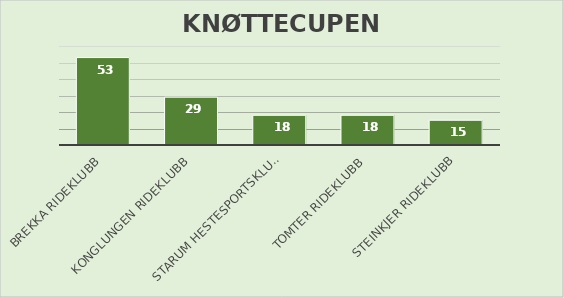
| Category | Series 0 | Series 1 | Series 2 | Series 3 | Series 4 | Series 5 | Series 6 | Series 7 | Series 8 | Series 9 | Series 10 | Series 11 | Series 12 | Series 13 | Series 14 | Series 15 | Series 16 | Series 17 | Series 18 | Series 19 | Series 20 | Series 21 | Series 22 | Series 23 | Series 24 | Series 25 | Series 26 | Series 27 | Series 28 | Series 29 | Series 30 | Series 31 | Series 32 |
|---|---|---|---|---|---|---|---|---|---|---|---|---|---|---|---|---|---|---|---|---|---|---|---|---|---|---|---|---|---|---|---|---|---|
| Brekka rideklubb |  |  |  |  |  |  |  |  |  |  |  |  |  |  |  |  |  |  |  |  |  |  |  |  |  |  |  |  |  |  |  |  | 53 |
| Konglungen rideklubb |  |  |  |  |  |  |  |  |  |  |  |  |  |  |  |  |  |  |  |  |  |  |  |  |  |  |  |  |  |  |  |  | 29 |
| Starum Hestesportsklubb |  |  |  |  |  |  |  |  |  |  |  |  |  |  |  |  |  |  |  |  |  |  |  |  |  |  |  |  |  |  |  |  | 18 |
| Tomter rideklubb |  |  |  |  |  |  |  |  |  |  |  |  |  |  |  |  |  |  |  |  |  |  |  |  |  |  |  |  |  |  |  |  | 18 |
| Steinkjer Rideklubb |  |  |  |  |  |  |  |  |  |  |  |  |  |  |  |  |  |  |  |  |  |  |  |  |  |  |  |  |  |  |  |  | 15 |